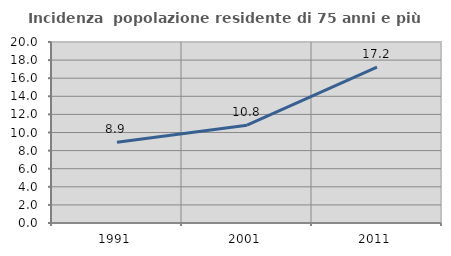
| Category | Incidenza  popolazione residente di 75 anni e più |
|---|---|
| 1991.0 | 8.925 |
| 2001.0 | 10.812 |
| 2011.0 | 17.236 |